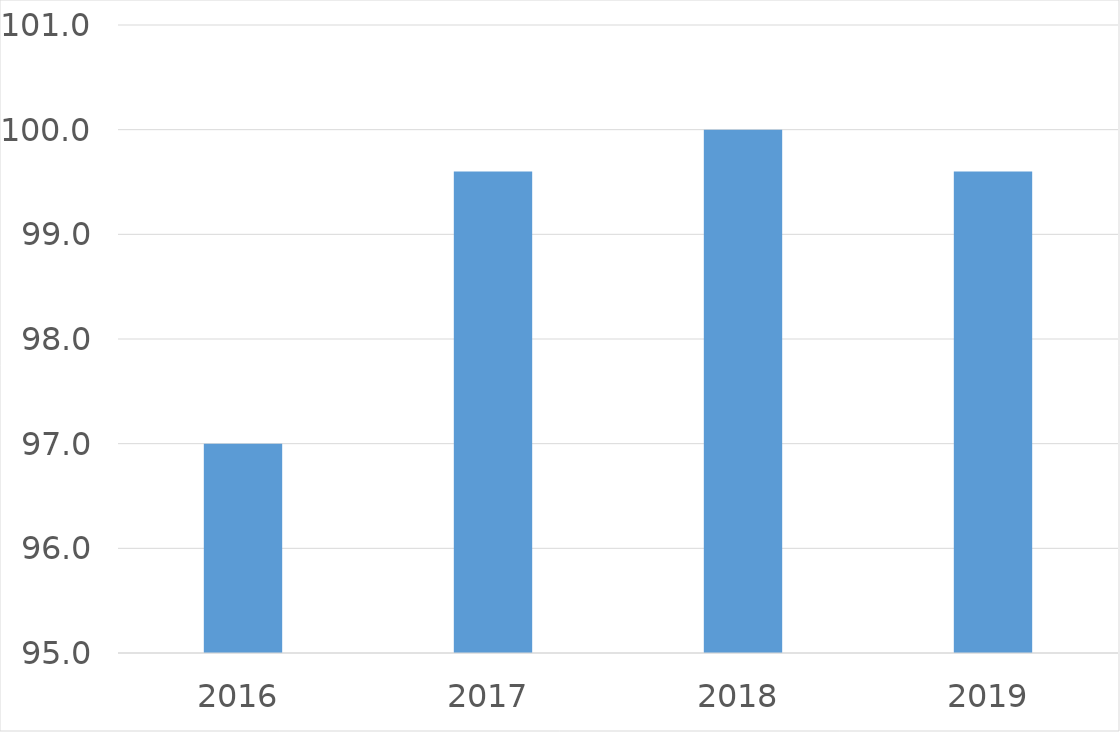
| Category | Series 0 |
|---|---|
| 2016 | 97 |
| 2017 | 99.6 |
| 2018 | 100 |
| 2019 | 99.6 |